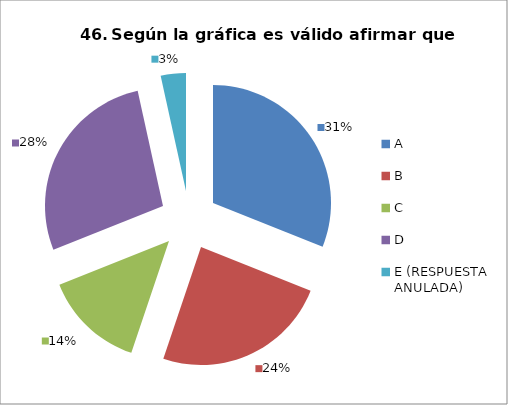
| Category | CANTIDAD DE RESPUESTAS PREGUNTA (46) | PORCENTAJE |
|---|---|---|
| A | 9 | 0.31 |
| B | 7 | 0.241 |
| C | 4 | 0.138 |
| D | 8 | 0.276 |
| E (RESPUESTA ANULADA) | 1 | 0.034 |